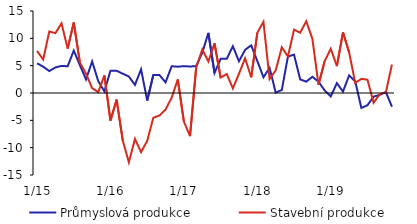
| Category | Průmyslová produkce | Stavební produkce |
|---|---|---|
|  1/15 | 5.423 | 7.692 |
| 2 | 4.824 | 6.12 |
| 3 | 4.011 | 11.252 |
| 4 | 4.673 | 10.955 |
| 5 | 4.954 | 12.736 |
| 6 | 4.89 | 8.133 |
| 7 | 7.761 | 12.894 |
| 8 | 5.085 | 5.572 |
| 9 | 2.48 | 3.521 |
| 10 | 5.77 | 0.886 |
| 11 | 2.183 | 0.153 |
| 12 | 0.298 | 3.229 |
|  1/16 | 4.082 | -5.04 |
| 2 | 4.067 | -1.217 |
| 3 | 3.536 | -8.648 |
| 4 | 3.02 | -12.675 |
| 5 | 1.479 | -8.404 |
| 6 | 4.337 | -10.818 |
| 7 | -1.377 | -8.761 |
| 8 | 3.3 | -4.531 |
| 9 | 3.287 | -4.125 |
| 10 | 1.948 | -3.028 |
| 11 | 4.893 | -0.85 |
| 12 | 4.815 | 2.467 |
|  1/17 | 4.911 | -5.228 |
| 2 | 4.842 | -7.902 |
| 3 | 4.923 | 4.597 |
| 4 | 7.366 | 7.967 |
| 5 | 10.999 | 5.767 |
| 6 | 3.668 | 9.098 |
| 7 | 6.243 | 2.827 |
| 8 | 6.251 | 3.475 |
| 9 | 8.557 | 0.844 |
| 10 | 5.808 | 3.524 |
| 11 | 7.89 | 6.357 |
| 12 | 8.721 | 2.867 |
|  1/18 | 5.838 | 11.019 |
| 2 | 2.875 | 13.021 |
| 3 | 4.602 | 2.548 |
| 4 | 0.087 | 4.129 |
| 5 | 0.553 | 8.363 |
| 6 | 6.668 | 6.679 |
| 7 | 7.015 | 11.593 |
| 8 | 2.494 | 11.032 |
| 9 | 2.074 | 13.129 |
| 10 | 2.97 | 9.886 |
| 11 | 2.062 | 1.516 |
| 12 | 0.466 | 5.814 |
|  1/19 | -0.618 | 8.09 |
| 2 | 1.802 | 4.926 |
| 3 | 0.253 | 11.095 |
| 4 | 3.222 | 7.44 |
| 5 | 2.144 | 1.844 |
| 6 | -2.737 | 2.585 |
| 7 | -2.235 | 2.438 |
| 8 | -0.668 | -1.776 |
| 9 | -0.352 | -0.247 |
| 10 | 0.198 | 0.098 |
| 11 | -2.514 | 5.205 |